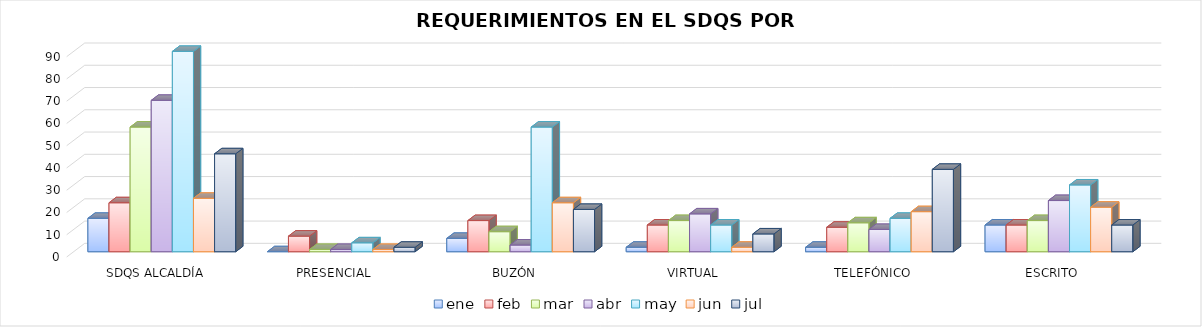
| Category | ene | feb | mar | abr | may | jun | jul |
|---|---|---|---|---|---|---|---|
| SDQS ALCALDÍA | 15 | 22 | 56 | 68 | 90 | 24 | 44 |
| PRESENCIAL | 0 | 7 | 1 | 1 | 4 | 1 | 2 |
| BUZÓN | 6 | 14 | 9 | 3 | 56 | 22 | 19 |
| VIRTUAL | 2 | 12 | 14 | 17 | 12 | 2 | 8 |
| TELEFÓNICO | 2 | 11 | 13 | 10 | 15 | 18 | 37 |
| ESCRITO | 12 | 12 | 14 | 23 | 30 | 20 | 12 |